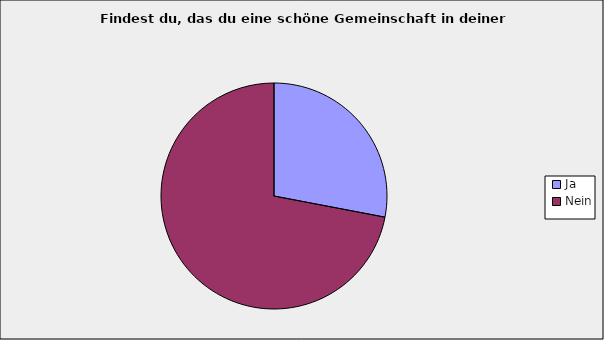
| Category | Series 0 |
|---|---|
| Ja | 0.28 |
| Nein | 0.72 |